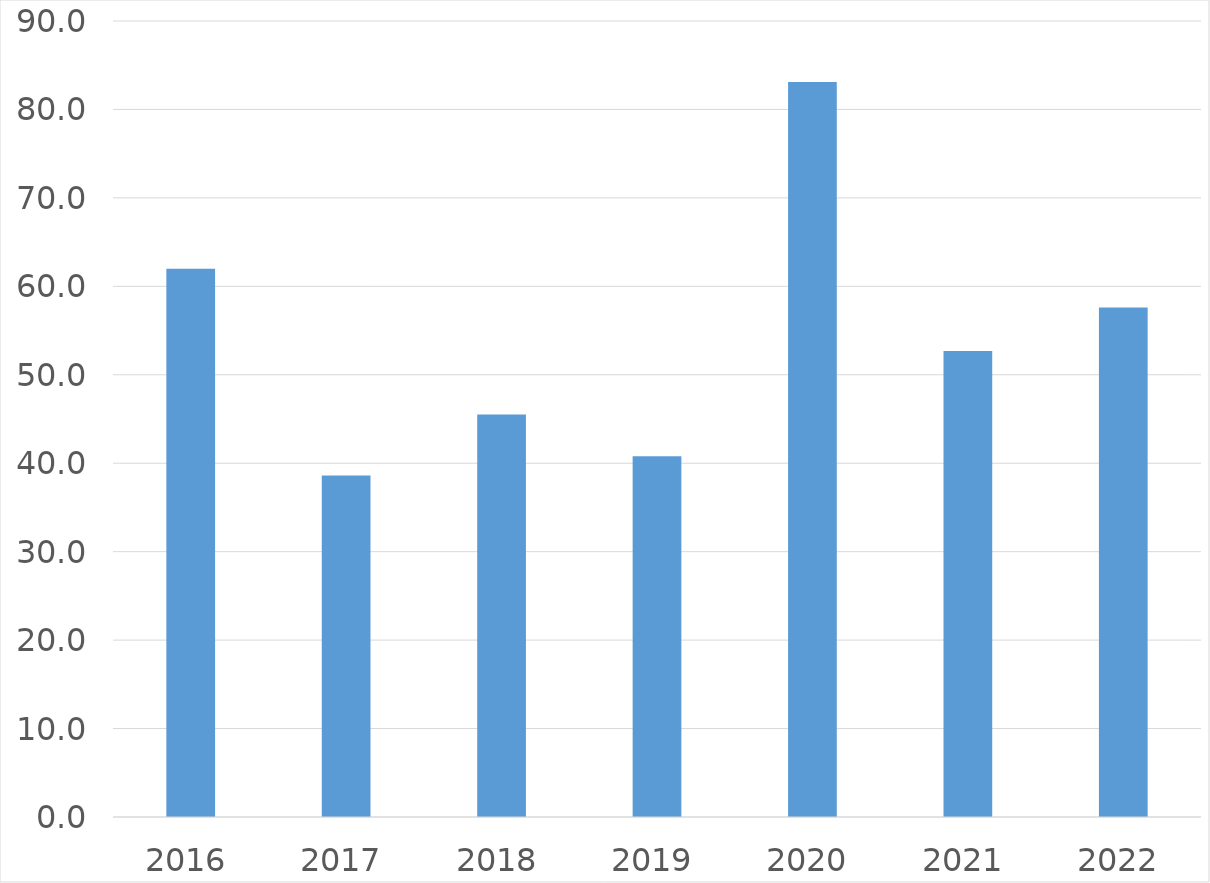
| Category | Series 0 |
|---|---|
| 2016 | 62 |
| 2017 | 38.6 |
| 2018 | 45.5 |
| 2019 | 40.8 |
| 2020 | 83.1 |
| 2021 | 52.7 |
| 2022 | 57.6 |